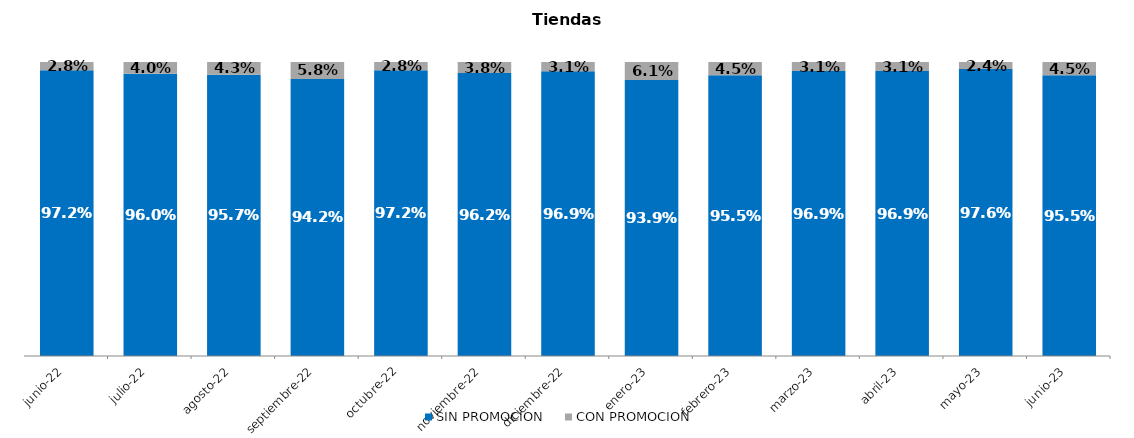
| Category | SIN PROMOCION   | CON PROMOCION   |
|---|---|---|
| 2022-06-01 | 0.972 | 0.028 |
| 2022-07-01 | 0.96 | 0.04 |
| 2022-08-01 | 0.957 | 0.043 |
| 2022-09-01 | 0.942 | 0.058 |
| 2022-10-01 | 0.972 | 0.028 |
| 2022-11-01 | 0.962 | 0.038 |
| 2022-12-01 | 0.969 | 0.031 |
| 2023-01-01 | 0.939 | 0.061 |
| 2023-02-01 | 0.955 | 0.045 |
| 2023-03-01 | 0.969 | 0.031 |
| 2023-04-01 | 0.969 | 0.031 |
| 2023-05-01 | 0.976 | 0.024 |
| 2023-06-01 | 0.955 | 0.045 |